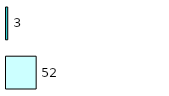
| Category | Series 0 | Series 1 |
|---|---|---|
| 0 | 52 | 3 |